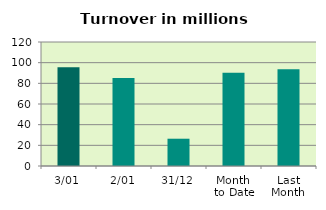
| Category | Series 0 |
|---|---|
| 3/01 | 95.446 |
| 2/01 | 85.211 |
| 31/12 | 26.399 |
| Month 
to Date | 90.328 |
| Last
Month | 93.592 |